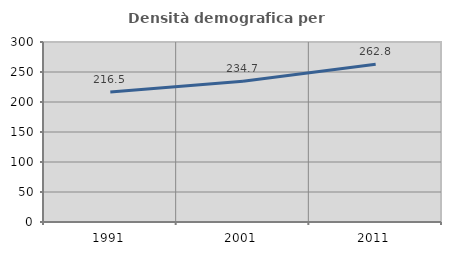
| Category | Densità demografica |
|---|---|
| 1991.0 | 216.516 |
| 2001.0 | 234.673 |
| 2011.0 | 262.795 |